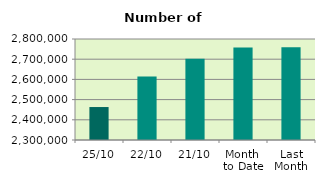
| Category | Series 0 |
|---|---|
| 25/10 | 2463192 |
| 22/10 | 2613930 |
| 21/10 | 2702010 |
| Month 
to Date | 2757986.118 |
| Last
Month | 2759252.364 |